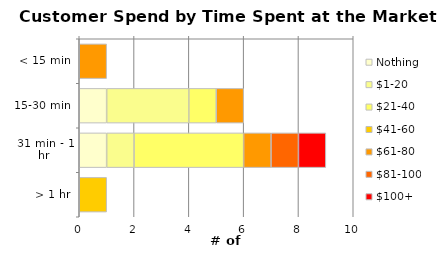
| Category | Nothing | $1-20 | $21-40 | $41-60 | $61-80 | $81-100 | $100+ |
|---|---|---|---|---|---|---|---|
| < 15 min | 0 | 0 | 0 | 0 | 1 | 0 | 0 |
| 15-30 min | 1 | 3 | 1 | 0 | 1 | 0 | 0 |
| 31 min - 1 hr | 1 | 1 | 4 | 0 | 1 | 1 | 1 |
| > 1 hr | 0 | 0 | 0 | 1 | 0 | 0 | 0 |